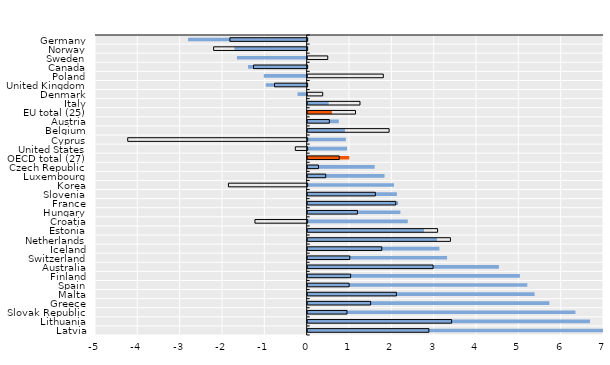
| Category | Foreign-born | Native-born |
|---|---|---|
| Germany | -2.801 | -1.825 |
| Norway | -1.709 | -2.21 |
| Sweden | -1.646 | 0.474 |
| Canada | -1.385 | -1.267 |
| Poland | -1.013 | 1.787 |
| United Kingdom | -0.965 | -0.771 |
| Denmark | -0.216 | 0.355 |
| Italy | 0.497 | 1.236 |
| EU total (25) | 0.572 | 1.13 |
| Austria | 0.735 | 0.512 |
| Belgium | 0.88 | 1.924 |
| Cyprus | 0.902 | -4.239 |
| United States | 0.93 | -0.28 |
| OECD total (27) | 0.983 | 0.746 |
| Czech Republic | 1.582 | 0.255 |
| Luxembourg | 1.816 | 0.427 |
| Korea | 2.04 | -1.86 |
| Slovenia | 2.107 | 1.599 |
| France | 2.137 | 2.08 |
| Hungary | 2.19 | 1.176 |
| Croatia | 2.365 | -1.234 |
| Estonia | 2.748 | 3.069 |
| Netherlands | 3.056 | 3.373 |
| Iceland | 3.112 | 1.751 |
| Switzerland | 3.293 | 0.996 |
| Australia | 4.517 | 2.963 |
| Finland | 5.015 | 1.016 |
| Spain | 5.189 | 0.98 |
| Malta | 5.36 | 2.096 |
| Greece | 5.71 | 1.488 |
| Slovak Republic | 6.325 | 0.929 |
| Lithuania | 6.669 | 3.401 |
| Latvia | 8.478 | 2.863 |